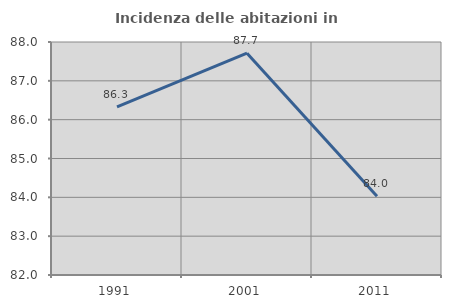
| Category | Incidenza delle abitazioni in proprietà  |
|---|---|
| 1991.0 | 86.327 |
| 2001.0 | 87.712 |
| 2011.0 | 84.031 |